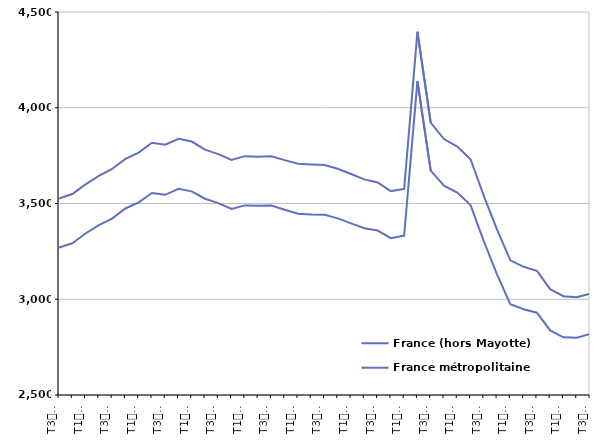
| Category | France (hors Mayotte) | France métropolitaine |
|---|---|---|
| T3
2013 | 3526.3 | 3270.2 |
| T4
2013 | 3549.3 | 3292.2 |
| T1
2014 | 3599.8 | 3343.3 |
| T2
2014 | 3644.7 | 3386.6 |
| T3
2014 | 3680.5 | 3421.2 |
| T4
2014 | 3733.2 | 3474 |
| T1
2015 | 3765.7 | 3505.6 |
| T2
2015 | 3817.2 | 3554.7 |
| T3
2015 | 3807.4 | 3545.5 |
| T4
2015 | 3837.4 | 3576.9 |
| T1
2016 | 3823.5 | 3563.5 |
| T2
2016 | 3780.9 | 3525 |
| T3
2016 | 3757.9 | 3502.3 |
| T4
2016 | 3727.6 | 3471.3 |
| T1
2017 | 3747.3 | 3490.1 |
| T2
2017 | 3744.7 | 3488.7 |
| T3
2017 | 3746.4 | 3489.5 |
| T4
2017 | 3726.6 | 3467.4 |
| T1
2018 | 3707.2 | 3446.8 |
| T2
2018 | 3703.5 | 3442.6 |
| T3
2018 | 3701 | 3440.7 |
| T4
2018 | 3681.3 | 3422.4 |
| T1
2019 | 3653.9 | 3396 |
| T2
2019 | 3625.8 | 3371 |
| T3
2019 | 3609.8 | 3358.7 |
| T4
2019 | 3564.7 | 3318.7 |
| T1
2020 | 3575.7 | 3332.6 |
| T2
2020 | 4396.8 | 4139 |
| T3
2020 | 3922.1 | 3672.1 |
| T4
2020 | 3836.5 | 3593.4 |
| T1
2021 | 3797.6 | 3557 |
| T2
2021 | 3731 | 3491.8 |
| T3
2021 | 3539.9 | 3303.9 |
| T4
2021 | 3363.3 | 3128.8 |
| T1
2022 | 3203.4 | 2974.4 |
| T2
2022 | 3169.5 | 2947.7 |
| T3
2022 | 3148.5 | 2929.9 |
| T4
2022 | 3052.7 | 2837 |
| T1
2023 | 3016 | 2801.4 |
| T2
2023 | 3011.1 | 2799.5 |
| T3
2023 | 3028.5 | 2818.8 |